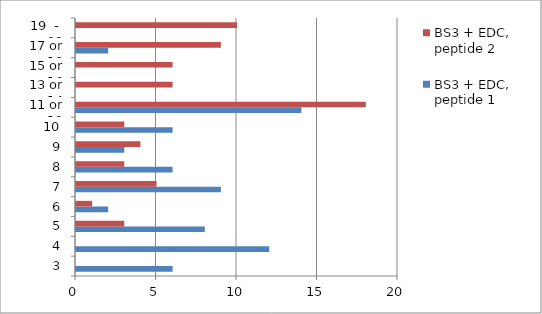
| Category | BS3 + EDC, peptide 1 | BS3 + EDC, peptide 2 |
|---|---|---|
| 3 | 6 | 0 |
| 4 | 12 | 0 |
| 5 | 8 | 3 |
| 6 | 2 | 1 |
| 7 | 9 | 5 |
| 8 | 6 | 3 |
| 9 | 3 | 4 |
| 10 | 6 | 3 |
| 11 or 12 | 14 | 18 |
| 13 or 14 | 0 | 6 |
| 15 or 16 | 0 | 6 |
| 17 or 18 | 2 | 9 |
| 19  -  32 | 0 | 10 |